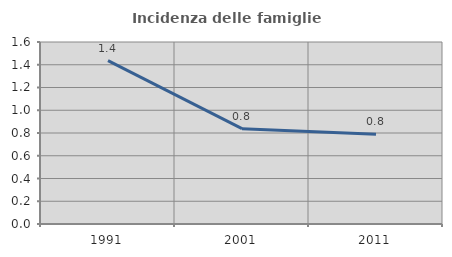
| Category | Incidenza delle famiglie numerose |
|---|---|
| 1991.0 | 1.437 |
| 2001.0 | 0.838 |
| 2011.0 | 0.789 |